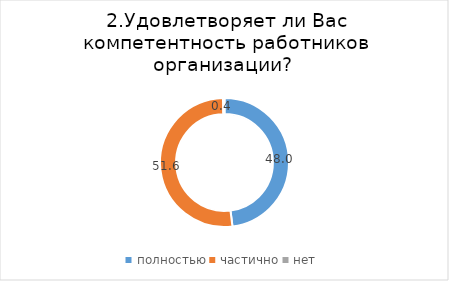
| Category | Series 0 |
|---|---|
| полностью | 48.029 |
| частично | 51.613 |
| нет | 0.358 |